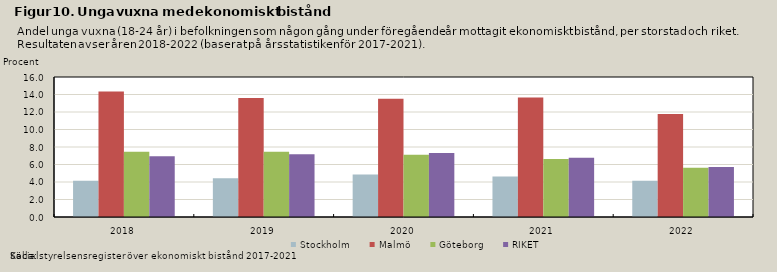
| Category | Stockholm | Malmö | Göteborg | RIKET |
|---|---|---|---|---|
| 2018.0 | 4.156 | 14.354 | 7.455 | 6.95 |
| 2019.0 | 4.428 | 13.595 | 7.461 | 7.157 |
| 2020.0 | 4.852 | 13.502 | 7.123 | 7.304 |
| 2021.0 | 4.62 | 13.646 | 6.621 | 6.765 |
| 2022.0 | 4.145 | 11.78 | 5.622 | 5.725 |